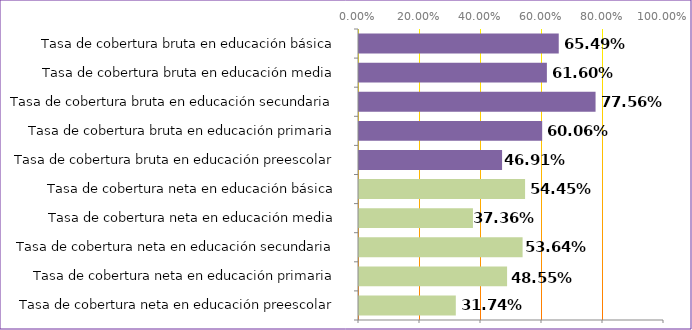
| Category | Series 0 |
|---|---|
| Tasa de cobertura neta en educación preescolar | 0.317 |
| Tasa de cobertura neta en educación primaria | 0.486 |
| Tasa de cobertura neta en educación secundaria | 0.536 |
| Tasa de cobertura neta en educación media | 0.374 |
| Tasa de cobertura neta en educación básica | 0.544 |
| Tasa de cobertura bruta en educación preescolar | 0.469 |
| Tasa de cobertura bruta en educación primaria | 0.601 |
| Tasa de cobertura bruta en educación secundaria | 0.776 |
| Tasa de cobertura bruta en educación media | 0.616 |
| Tasa de cobertura bruta en educación básica | 0.655 |